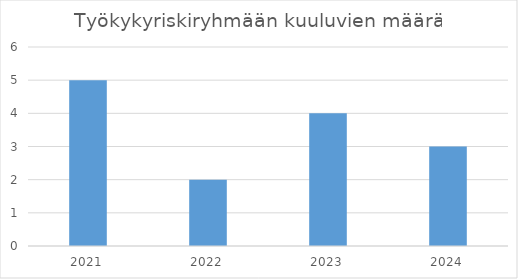
| Category | Työkykyriskiryhmään kuuluvien määrä |
|---|---|
| 2021.0 | 5 |
| 2022.0 | 2 |
| 2023.0 | 4 |
| 2024.0 | 3 |